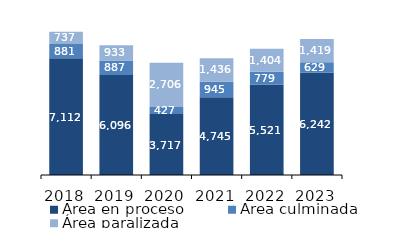
| Category | Área en proceso | Área culminada | Área paralizada |
|---|---|---|---|
| 2018.0 | 7112.476 | 880.983 | 736.757 |
| 2019.0 | 6096.222 | 887.325 | 932.514 |
| 2020.0 | 3716.886 | 427.11 | 2706.028 |
| 2021.0 | 4744.91 | 945.479 | 1435.69 |
| 2022.0 | 5520.73 | 778.723 | 1404.472 |
| 2023.0 | 6242.208 | 629.405 | 1419.358 |